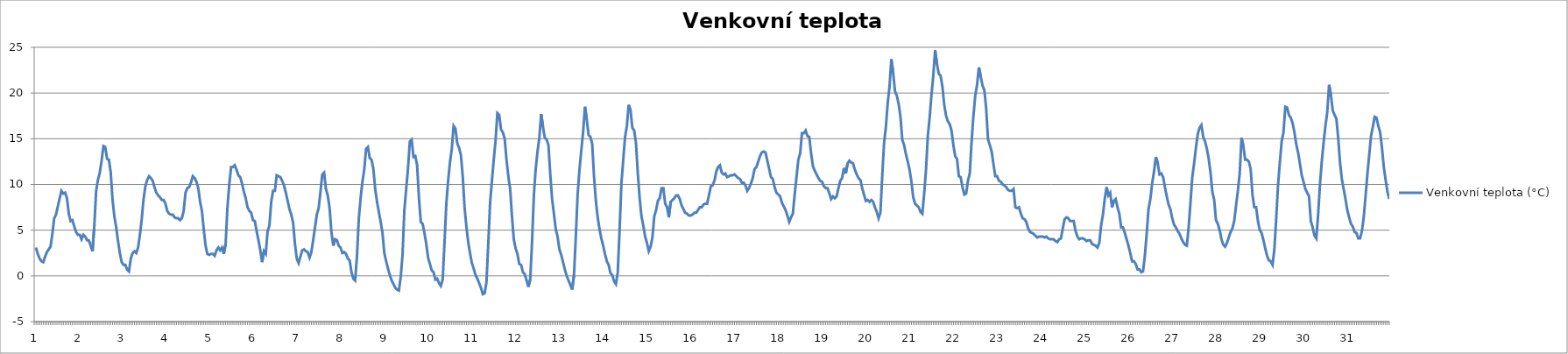
| Category | Venkovní teplota (°C) |
|---|---|
| 0 | 3.1 |
| 1 | 2.4 |
| 2 | 1.9 |
| 3 | 1.6 |
| 4 | 1.5 |
| 5 | 2.1 |
| 6 | 2.6 |
| 7 | 2.9 |
| 8 | 3.2 |
| 9 | 4.6 |
| 10 | 6.3 |
| 11 | 6.7 |
| 12 | 7.6 |
| 13 | 8.5 |
| 14 | 9.3 |
| 15 | 9 |
| 16 | 9.1 |
| 17 | 8.5 |
| 18 | 6.8 |
| 19 | 6 |
| 20 | 6.1 |
| 21 | 5.4 |
| 22 | 4.8 |
| 23 | 4.5 |
| 24 | 4.5 |
| 25 | 4 |
| 26 | 4.5 |
| 27 | 4.3 |
| 28 | 3.9 |
| 29 | 3.9 |
| 30 | 3.3 |
| 31 | 2.7 |
| 32 | 5.5 |
| 33 | 9.3 |
| 34 | 10.5 |
| 35 | 11.3 |
| 36 | 12.6 |
| 37 | 14.2 |
| 38 | 14.1 |
| 39 | 12.8 |
| 40 | 12.7 |
| 41 | 11.3 |
| 42 | 8.3 |
| 43 | 6.5 |
| 44 | 5.3 |
| 45 | 3.8 |
| 46 | 2.5 |
| 47 | 1.5 |
| 48 | 1.2 |
| 49 | 1.2 |
| 50 | 0.7 |
| 51 | 0.5 |
| 52 | 1.9 |
| 53 | 2.5 |
| 54 | 2.7 |
| 55 | 2.5 |
| 56 | 3.1 |
| 57 | 4.5 |
| 58 | 6.2 |
| 59 | 8.4 |
| 60 | 9.8 |
| 61 | 10.5 |
| 62 | 10.9 |
| 63 | 10.7 |
| 64 | 10.4 |
| 65 | 9.7 |
| 66 | 9.1 |
| 67 | 8.8 |
| 68 | 8.6 |
| 69 | 8.3 |
| 70 | 8.3 |
| 71 | 7.9 |
| 72 | 7.1 |
| 73 | 6.8 |
| 74 | 6.7 |
| 75 | 6.7 |
| 76 | 6.4 |
| 77 | 6.3 |
| 78 | 6.3 |
| 79 | 6.1 |
| 80 | 6.3 |
| 81 | 7.1 |
| 82 | 9.1 |
| 83 | 9.6 |
| 84 | 9.7 |
| 85 | 10.2 |
| 86 | 10.9 |
| 87 | 10.7 |
| 88 | 10.3 |
| 89 | 9.6 |
| 90 | 8.1 |
| 91 | 7.1 |
| 92 | 5.1 |
| 93 | 3.3 |
| 94 | 2.4 |
| 95 | 2.3 |
| 96 | 2.4 |
| 97 | 2.4 |
| 98 | 2.2 |
| 99 | 2.8 |
| 100 | 3.1 |
| 101 | 2.8 |
| 102 | 3.1 |
| 103 | 2.4 |
| 104 | 3.5 |
| 105 | 7.5 |
| 106 | 10 |
| 107 | 11.9 |
| 108 | 11.9 |
| 109 | 12.1 |
| 110 | 11.6 |
| 111 | 11 |
| 112 | 10.8 |
| 113 | 10.1 |
| 114 | 9.2 |
| 115 | 8.5 |
| 116 | 7.5 |
| 117 | 7.1 |
| 118 | 6.9 |
| 119 | 6.1 |
| 120 | 6 |
| 121 | 4.9 |
| 122 | 3.9 |
| 123 | 2.8 |
| 124 | 1.5 |
| 125 | 2.7 |
| 126 | 2.4 |
| 127 | 4.9 |
| 128 | 5.5 |
| 129 | 8.1 |
| 130 | 9.3 |
| 131 | 9.3 |
| 132 | 11 |
| 133 | 10.9 |
| 134 | 10.8 |
| 135 | 10.4 |
| 136 | 9.9 |
| 137 | 9.1 |
| 138 | 8.2 |
| 139 | 7.3 |
| 140 | 6.7 |
| 141 | 5.8 |
| 142 | 3.5 |
| 143 | 1.9 |
| 144 | 1.4 |
| 145 | 2.1 |
| 146 | 2.8 |
| 147 | 2.9 |
| 148 | 2.7 |
| 149 | 2.6 |
| 150 | 2 |
| 151 | 2.6 |
| 152 | 3.9 |
| 153 | 5.3 |
| 154 | 6.7 |
| 155 | 7.4 |
| 156 | 9.2 |
| 157 | 11.1 |
| 158 | 11.3 |
| 159 | 9.5 |
| 160 | 8.8 |
| 161 | 7.4 |
| 162 | 4.8 |
| 163 | 3.3 |
| 164 | 4 |
| 165 | 3.9 |
| 166 | 3.3 |
| 167 | 3.1 |
| 168 | 2.5 |
| 169 | 2.6 |
| 170 | 2.4 |
| 171 | 1.9 |
| 172 | 1.7 |
| 173 | 0.4 |
| 174 | -0.3 |
| 175 | -0.5 |
| 176 | 2.1 |
| 177 | 6.2 |
| 178 | 8.5 |
| 179 | 10.3 |
| 180 | 11.6 |
| 181 | 13.9 |
| 182 | 14.1 |
| 183 | 12.9 |
| 184 | 12.7 |
| 185 | 11.7 |
| 186 | 9.5 |
| 187 | 8.1 |
| 188 | 7 |
| 189 | 5.9 |
| 190 | 4.7 |
| 191 | 2.5 |
| 192 | 1.6 |
| 193 | 0.8 |
| 194 | 0.1 |
| 195 | -0.5 |
| 196 | -0.9 |
| 197 | -1.3 |
| 198 | -1.5 |
| 199 | -1.6 |
| 200 | -0.1 |
| 201 | 2.3 |
| 202 | 7.2 |
| 203 | 9.5 |
| 204 | 11.8 |
| 205 | 14.7 |
| 206 | 14.9 |
| 207 | 13 |
| 208 | 13.1 |
| 209 | 12.1 |
| 210 | 8.5 |
| 211 | 5.9 |
| 212 | 5.7 |
| 213 | 4.7 |
| 214 | 3.5 |
| 215 | 2 |
| 216 | 1.3 |
| 217 | 0.6 |
| 218 | 0.4 |
| 219 | -0.4 |
| 220 | -0.3 |
| 221 | -0.8 |
| 222 | -1.1 |
| 223 | -0.4 |
| 224 | 3.6 |
| 225 | 7.9 |
| 226 | 10.4 |
| 227 | 12.4 |
| 228 | 13.9 |
| 229 | 16.4 |
| 230 | 16.1 |
| 231 | 14.5 |
| 232 | 14 |
| 233 | 13.2 |
| 234 | 10.9 |
| 235 | 7.5 |
| 236 | 5.4 |
| 237 | 3.7 |
| 238 | 2.5 |
| 239 | 1.4 |
| 240 | 0.8 |
| 241 | 0.1 |
| 242 | -0.3 |
| 243 | -0.8 |
| 244 | -1.3 |
| 245 | -2 |
| 246 | -1.9 |
| 247 | -0.7 |
| 248 | 3.5 |
| 249 | 8 |
| 250 | 10.4 |
| 251 | 12.7 |
| 252 | 14.8 |
| 253 | 17.8 |
| 254 | 17.6 |
| 255 | 16 |
| 256 | 15.7 |
| 257 | 15 |
| 258 | 12.7 |
| 259 | 10.9 |
| 260 | 9.5 |
| 261 | 6.5 |
| 262 | 4 |
| 263 | 3 |
| 264 | 2.4 |
| 265 | 1.3 |
| 266 | 1.2 |
| 267 | 0.4 |
| 268 | 0.2 |
| 269 | -0.5 |
| 270 | -1.2 |
| 271 | -0.4 |
| 272 | 3.7 |
| 273 | 8.8 |
| 274 | 11.7 |
| 275 | 13.6 |
| 276 | 15.1 |
| 277 | 17.7 |
| 278 | 16.3 |
| 279 | 15.1 |
| 280 | 14.9 |
| 281 | 14.3 |
| 282 | 11.1 |
| 283 | 8.4 |
| 284 | 6.8 |
| 285 | 5.1 |
| 286 | 4.3 |
| 287 | 2.9 |
| 288 | 2.3 |
| 289 | 1.5 |
| 290 | 0.7 |
| 291 | 0 |
| 292 | -0.5 |
| 293 | -1 |
| 294 | -1.5 |
| 295 | 0.1 |
| 296 | 4.3 |
| 297 | 8.9 |
| 298 | 11.6 |
| 299 | 13.7 |
| 300 | 15.7 |
| 301 | 18.5 |
| 302 | 17.1 |
| 303 | 15.4 |
| 304 | 15.2 |
| 305 | 14.4 |
| 306 | 10.8 |
| 307 | 8.2 |
| 308 | 6.4 |
| 309 | 5.1 |
| 310 | 4.1 |
| 311 | 3.3 |
| 312 | 2.4 |
| 313 | 1.6 |
| 314 | 1.2 |
| 315 | 0.3 |
| 316 | 0.1 |
| 317 | -0.6 |
| 318 | -0.9 |
| 319 | 0.4 |
| 320 | 5 |
| 321 | 10.1 |
| 322 | 12.7 |
| 323 | 15.2 |
| 324 | 16.4 |
| 325 | 18.7 |
| 326 | 18.1 |
| 327 | 16.2 |
| 328 | 15.9 |
| 329 | 14.5 |
| 330 | 11.2 |
| 331 | 8.5 |
| 332 | 6.5 |
| 333 | 5.5 |
| 334 | 4.3 |
| 335 | 3.6 |
| 336 | 2.7 |
| 337 | 3.2 |
| 338 | 4.2 |
| 339 | 6.5 |
| 340 | 7.2 |
| 341 | 8.2 |
| 342 | 8.5 |
| 343 | 9.6 |
| 344 | 9.6 |
| 345 | 7.9 |
| 346 | 7.5 |
| 347 | 6.4 |
| 348 | 8.1 |
| 349 | 8.3 |
| 350 | 8.5 |
| 351 | 8.8 |
| 352 | 8.8 |
| 353 | 8.4 |
| 354 | 7.7 |
| 355 | 7.3 |
| 356 | 6.9 |
| 357 | 6.8 |
| 358 | 6.6 |
| 359 | 6.6 |
| 360 | 6.7 |
| 361 | 6.9 |
| 362 | 6.9 |
| 363 | 7.2 |
| 364 | 7.5 |
| 365 | 7.5 |
| 366 | 7.8 |
| 367 | 7.9 |
| 368 | 7.9 |
| 369 | 8.8 |
| 370 | 9.8 |
| 371 | 9.9 |
| 372 | 10.4 |
| 373 | 11.4 |
| 374 | 11.9 |
| 375 | 12.1 |
| 376 | 11.3 |
| 377 | 11.1 |
| 378 | 11.2 |
| 379 | 10.8 |
| 380 | 10.9 |
| 381 | 11 |
| 382 | 11 |
| 383 | 11.1 |
| 384 | 10.9 |
| 385 | 10.7 |
| 386 | 10.6 |
| 387 | 10.2 |
| 388 | 10.2 |
| 389 | 9.9 |
| 390 | 9.3 |
| 391 | 9.6 |
| 392 | 10.1 |
| 393 | 10.7 |
| 394 | 11.7 |
| 395 | 11.9 |
| 396 | 12.5 |
| 397 | 13.1 |
| 398 | 13.5 |
| 399 | 13.6 |
| 400 | 13.5 |
| 401 | 12.6 |
| 402 | 11.7 |
| 403 | 10.8 |
| 404 | 10.6 |
| 405 | 9.7 |
| 406 | 9.1 |
| 407 | 8.9 |
| 408 | 8.7 |
| 409 | 8 |
| 410 | 7.6 |
| 411 | 7.2 |
| 412 | 6.6 |
| 413 | 5.9 |
| 414 | 6.4 |
| 415 | 6.8 |
| 416 | 8.9 |
| 417 | 10.8 |
| 418 | 12.7 |
| 419 | 13.4 |
| 420 | 15.6 |
| 421 | 15.6 |
| 422 | 15.9 |
| 423 | 15.3 |
| 424 | 15.2 |
| 425 | 13.4 |
| 426 | 12 |
| 427 | 11.5 |
| 428 | 11.1 |
| 429 | 10.7 |
| 430 | 10.4 |
| 431 | 10.3 |
| 432 | 9.8 |
| 433 | 9.6 |
| 434 | 9.6 |
| 435 | 9 |
| 436 | 8.4 |
| 437 | 8.7 |
| 438 | 8.5 |
| 439 | 8.7 |
| 440 | 9.6 |
| 441 | 10.4 |
| 442 | 10.7 |
| 443 | 11.8 |
| 444 | 11.2 |
| 445 | 12.3 |
| 446 | 12.6 |
| 447 | 12.4 |
| 448 | 12.3 |
| 449 | 11.6 |
| 450 | 11.1 |
| 451 | 10.7 |
| 452 | 10.5 |
| 453 | 9.6 |
| 454 | 8.9 |
| 455 | 8.2 |
| 456 | 8.3 |
| 457 | 8.1 |
| 458 | 8.3 |
| 459 | 8.1 |
| 460 | 7.5 |
| 461 | 7 |
| 462 | 6.3 |
| 463 | 6.9 |
| 464 | 10.9 |
| 465 | 14.5 |
| 466 | 16.3 |
| 467 | 18.9 |
| 468 | 20.7 |
| 469 | 23.7 |
| 470 | 22.2 |
| 471 | 20.2 |
| 472 | 19.7 |
| 473 | 18.8 |
| 474 | 17.4 |
| 475 | 14.9 |
| 476 | 14.3 |
| 477 | 13.3 |
| 478 | 12.5 |
| 479 | 11.6 |
| 480 | 10.3 |
| 481 | 8.6 |
| 482 | 7.9 |
| 483 | 7.7 |
| 484 | 7.5 |
| 485 | 7 |
| 486 | 6.8 |
| 487 | 9 |
| 488 | 11.6 |
| 489 | 15.3 |
| 490 | 17.3 |
| 491 | 19.8 |
| 492 | 21.9 |
| 493 | 24.7 |
| 494 | 23.2 |
| 495 | 22.1 |
| 496 | 21.9 |
| 497 | 20.7 |
| 498 | 18.7 |
| 499 | 17.5 |
| 500 | 16.9 |
| 501 | 16.6 |
| 502 | 15.9 |
| 503 | 14.3 |
| 504 | 13.1 |
| 505 | 12.8 |
| 506 | 10.9 |
| 507 | 10.8 |
| 508 | 9.7 |
| 509 | 8.9 |
| 510 | 9 |
| 511 | 10.4 |
| 512 | 11.2 |
| 513 | 14.7 |
| 514 | 17.5 |
| 515 | 19.7 |
| 516 | 20.9 |
| 517 | 22.8 |
| 518 | 21.8 |
| 519 | 20.8 |
| 520 | 20.3 |
| 521 | 18.3 |
| 522 | 14.9 |
| 523 | 14.3 |
| 524 | 13.6 |
| 525 | 12.2 |
| 526 | 10.9 |
| 527 | 10.9 |
| 528 | 10.4 |
| 529 | 10.3 |
| 530 | 10 |
| 531 | 9.9 |
| 532 | 9.7 |
| 533 | 9.4 |
| 534 | 9.3 |
| 535 | 9.3 |
| 536 | 9.5 |
| 537 | 7.5 |
| 538 | 7.4 |
| 539 | 7.5 |
| 540 | 6.8 |
| 541 | 6.3 |
| 542 | 6.2 |
| 543 | 5.9 |
| 544 | 5.2 |
| 545 | 4.8 |
| 546 | 4.7 |
| 547 | 4.6 |
| 548 | 4.4 |
| 549 | 4.2 |
| 550 | 4.3 |
| 551 | 4.3 |
| 552 | 4.3 |
| 553 | 4.2 |
| 554 | 4.3 |
| 555 | 4.1 |
| 556 | 4 |
| 557 | 4 |
| 558 | 4 |
| 559 | 3.8 |
| 560 | 3.7 |
| 561 | 4 |
| 562 | 4.1 |
| 563 | 5.2 |
| 564 | 6.2 |
| 565 | 6.4 |
| 566 | 6.3 |
| 567 | 6 |
| 568 | 6 |
| 569 | 6 |
| 570 | 4.9 |
| 571 | 4.3 |
| 572 | 4 |
| 573 | 4.1 |
| 574 | 4.1 |
| 575 | 4 |
| 576 | 3.8 |
| 577 | 3.9 |
| 578 | 3.9 |
| 579 | 3.5 |
| 580 | 3.4 |
| 581 | 3.3 |
| 582 | 3.1 |
| 583 | 3.6 |
| 584 | 5.5 |
| 585 | 6.7 |
| 586 | 8.4 |
| 587 | 9.7 |
| 588 | 8.8 |
| 589 | 9.1 |
| 590 | 7.5 |
| 591 | 8.2 |
| 592 | 8.4 |
| 593 | 7.5 |
| 594 | 6.8 |
| 595 | 5.3 |
| 596 | 5.3 |
| 597 | 4.7 |
| 598 | 4 |
| 599 | 3.3 |
| 600 | 2.5 |
| 601 | 1.6 |
| 602 | 1.6 |
| 603 | 1.3 |
| 604 | 0.7 |
| 605 | 0.7 |
| 606 | 0.4 |
| 607 | 0.5 |
| 608 | 2.2 |
| 609 | 4.6 |
| 610 | 7.3 |
| 611 | 8.4 |
| 612 | 10.1 |
| 613 | 11.4 |
| 614 | 13 |
| 615 | 12.4 |
| 616 | 11.1 |
| 617 | 11.2 |
| 618 | 10.8 |
| 619 | 9.7 |
| 620 | 8.7 |
| 621 | 7.8 |
| 622 | 7.3 |
| 623 | 6.3 |
| 624 | 5.6 |
| 625 | 5.3 |
| 626 | 4.9 |
| 627 | 4.6 |
| 628 | 4.1 |
| 629 | 3.7 |
| 630 | 3.4 |
| 631 | 3.3 |
| 632 | 5.3 |
| 633 | 8 |
| 634 | 10.8 |
| 635 | 12.3 |
| 636 | 14 |
| 637 | 15.5 |
| 638 | 16.2 |
| 639 | 16.5 |
| 640 | 15.2 |
| 641 | 14.7 |
| 642 | 13.9 |
| 643 | 12.8 |
| 644 | 11.3 |
| 645 | 9.2 |
| 646 | 8.3 |
| 647 | 6.1 |
| 648 | 5.7 |
| 649 | 5 |
| 650 | 4 |
| 651 | 3.4 |
| 652 | 3.2 |
| 653 | 3.6 |
| 654 | 4.2 |
| 655 | 4.8 |
| 656 | 5.2 |
| 657 | 6 |
| 658 | 7.7 |
| 659 | 9.3 |
| 660 | 11.2 |
| 661 | 15.1 |
| 662 | 14.2 |
| 663 | 12.7 |
| 664 | 12.7 |
| 665 | 12.5 |
| 666 | 11.7 |
| 667 | 8.9 |
| 668 | 7.5 |
| 669 | 7.5 |
| 670 | 6 |
| 671 | 5 |
| 672 | 4.7 |
| 673 | 3.9 |
| 674 | 3 |
| 675 | 2.2 |
| 676 | 1.7 |
| 677 | 1.6 |
| 678 | 1.2 |
| 679 | 2.9 |
| 680 | 6.2 |
| 681 | 9.9 |
| 682 | 12.4 |
| 683 | 14.7 |
| 684 | 15.7 |
| 685 | 18.5 |
| 686 | 18.4 |
| 687 | 17.6 |
| 688 | 17.3 |
| 689 | 16.7 |
| 690 | 15.7 |
| 691 | 14.4 |
| 692 | 13.5 |
| 693 | 12.3 |
| 694 | 11 |
| 695 | 10.3 |
| 696 | 9.5 |
| 697 | 9.1 |
| 698 | 8.7 |
| 699 | 6 |
| 700 | 5.3 |
| 701 | 4.4 |
| 702 | 4.1 |
| 703 | 6.7 |
| 704 | 10 |
| 705 | 12.5 |
| 706 | 14.6 |
| 707 | 16.4 |
| 708 | 17.9 |
| 709 | 20.9 |
| 710 | 19.8 |
| 711 | 18.1 |
| 712 | 17.6 |
| 713 | 17.2 |
| 714 | 15.1 |
| 715 | 12.4 |
| 716 | 10.6 |
| 717 | 9.5 |
| 718 | 8.4 |
| 719 | 7.2 |
| 720 | 6.4 |
| 721 | 5.7 |
| 722 | 5.4 |
| 723 | 4.8 |
| 724 | 4.7 |
| 725 | 4.1 |
| 726 | 4.1 |
| 727 | 4.9 |
| 728 | 6.4 |
| 729 | 8.7 |
| 730 | 11.1 |
| 731 | 13.2 |
| 732 | 15.3 |
| 733 | 16.3 |
| 734 | 17.4 |
| 735 | 17.3 |
| 736 | 16.4 |
| 737 | 15.7 |
| 738 | 14 |
| 739 | 11.9 |
| 740 | 10.5 |
| 741 | 9.2 |
| 742 | 8.4 |